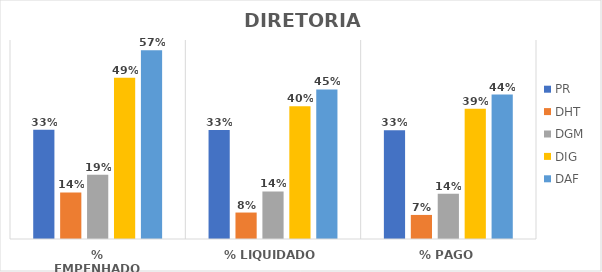
| Category | PR | DHT | DGM | DIG | DAF |
|---|---|---|---|---|---|
| % EMPENHADO | 0.329 | 0.14 | 0.194 | 0.486 | 0.569 |
| % LIQUIDADO | 0.328 | 0.08 | 0.143 | 0.4 | 0.451 |
| % PAGO | 0.328 | 0.073 | 0.136 | 0.393 | 0.436 |